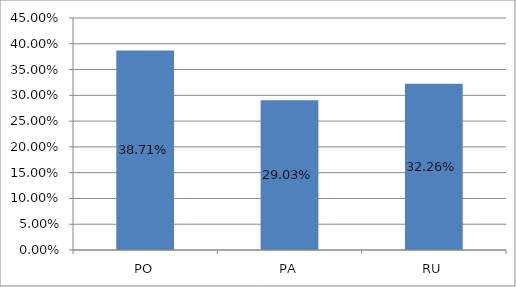
| Category | Series 0 |
|---|---|
| PO | 0.387 |
| PA | 0.29 |
| RU | 0.323 |